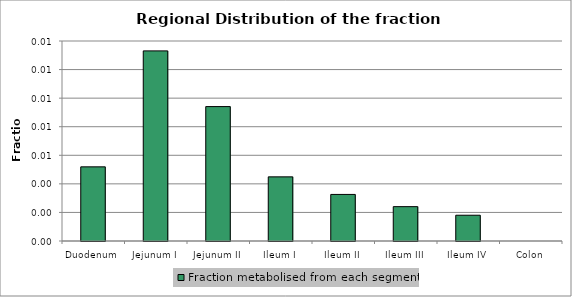
| Category | Fraction metabolised from each segment |
|---|---|
| Duodenum | 0.005 |
| Jejunum I | 0.013 |
| Jejunum II | 0.009 |
| Ileum I | 0.004 |
| Ileum II | 0.003 |
| Ileum III | 0.002 |
| Ileum IV | 0.002 |
| Colon | 0 |